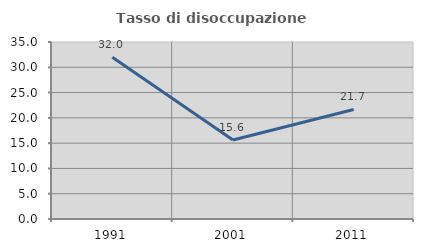
| Category | Tasso di disoccupazione giovanile  |
|---|---|
| 1991.0 | 32 |
| 2001.0 | 15.625 |
| 2011.0 | 21.667 |